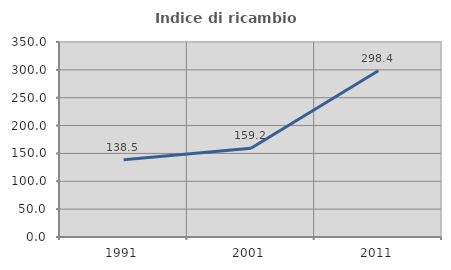
| Category | Indice di ricambio occupazionale  |
|---|---|
| 1991.0 | 138.462 |
| 2001.0 | 159.227 |
| 2011.0 | 298.374 |